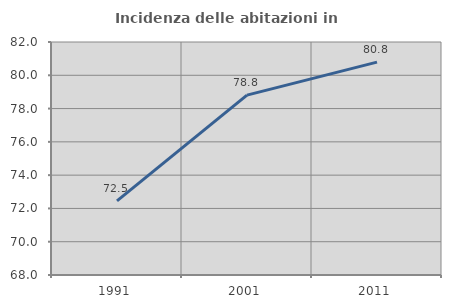
| Category | Incidenza delle abitazioni in proprietà  |
|---|---|
| 1991.0 | 72.452 |
| 2001.0 | 78.807 |
| 2011.0 | 80.792 |